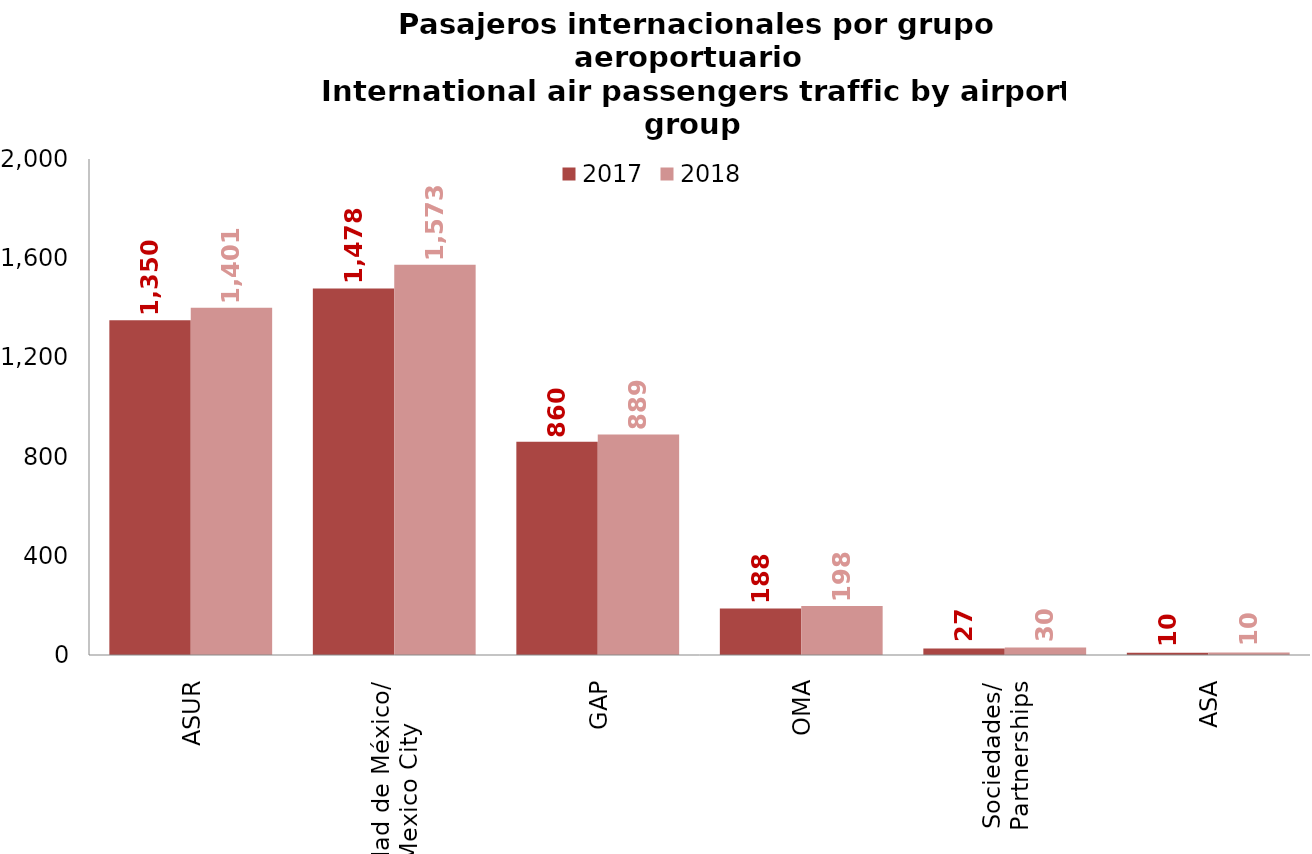
| Category | 2017 | 2018 |
|---|---|---|
| ASUR | 1349.925 | 1400.697 |
| Ciudad de México/
Mexico City | 1478.042 | 1573.323 |
| GAP | 859.612 | 889.466 |
| OMA | 188.004 | 197.684 |
| Sociedades/
Partnerships | 26.658 | 30.241 |
| ASA | 9.562 | 10.484 |